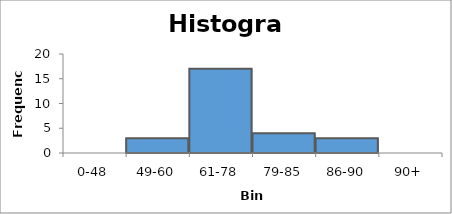
| Category | Frequency |
|---|---|
| 0-48 | 0 |
| 49-60 | 3 |
| 61-78 | 17 |
| 79-85 | 4 |
| 86-90 | 3 |
| 90+ | 0 |